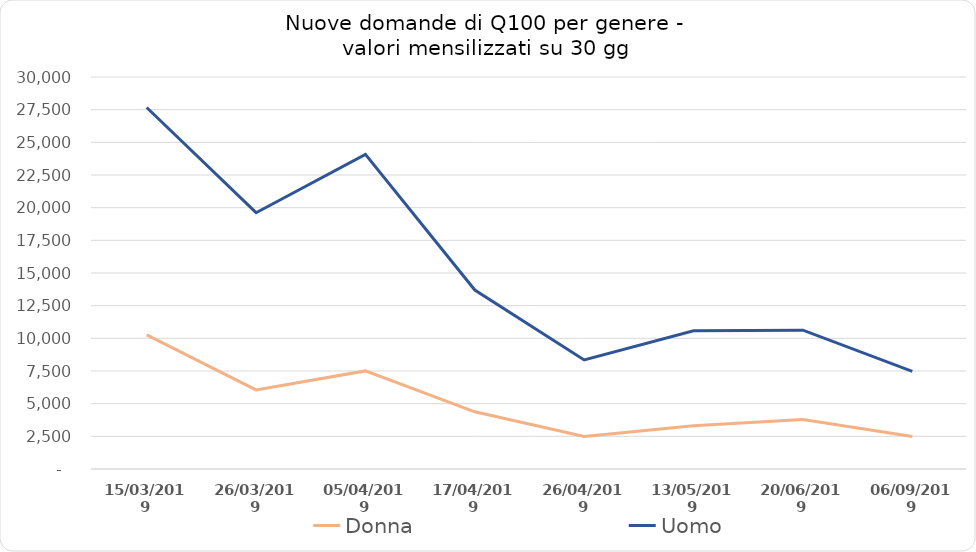
| Category | Donna | Uomo |
|---|---|---|
| 15/03/2019 | 10262.432 | 27664.459 |
| 26/03/2019 | 6054.545 | 19614.545 |
| 05/04/2019 | 7506 | 24084 |
| 17/04/2019 | 4375 | 13695 |
| 26/04/2019 | 2496.667 | 8346.667 |
| 13/05/2019 | 3303.529 | 10579.412 |
| 20/06/2019 | 3785.526 | 10627.105 |
| 06/09/2019 | 2491.538 | 7468.462 |